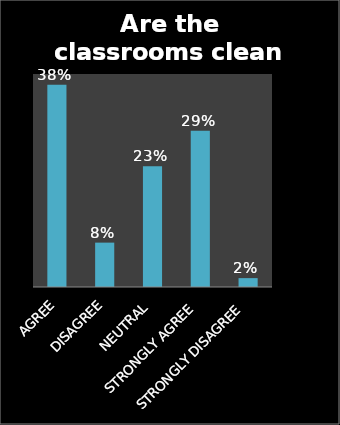
| Category | Series 0 |
|---|---|
| AGREE | 0.38 |
| DISAGREE | 0.083 |
| NEUTRAL | 0.227 |
| STRONGLY AGREE | 0.293 |
| STRONGLY DISAGREE | 0.017 |